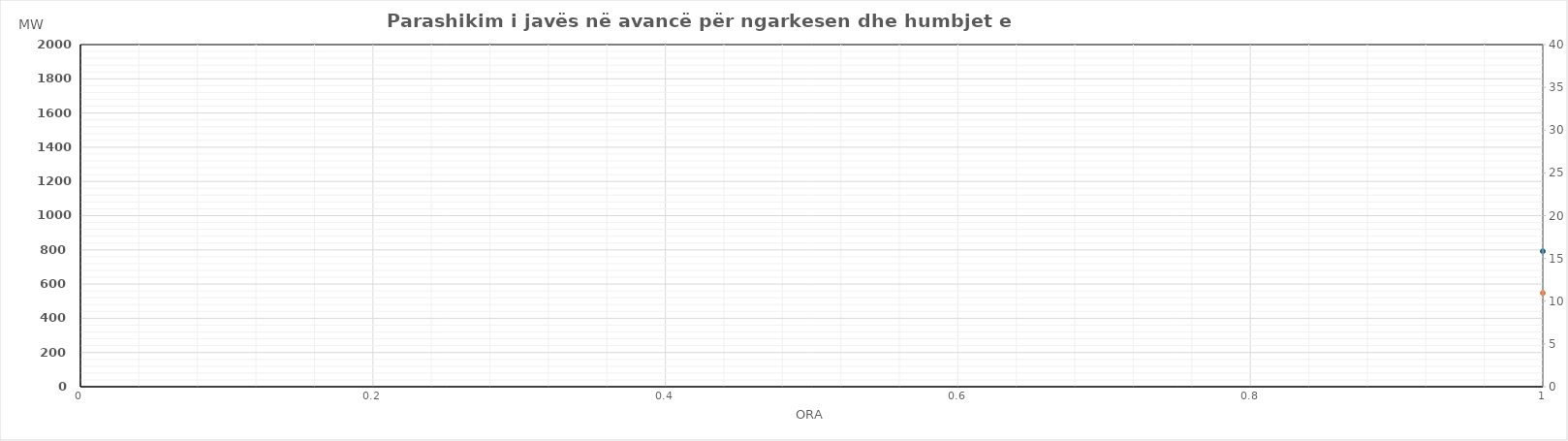
| Category | Ngarkesa (MWh) |
|---|---|
| 0 | 547.99 |
| 1 | 465.35 |
| 2 | 449.32 |
| 3 | 482.35 |
| 4 | 465.37 |
| 5 | 391.16 |
| 6 | 708.09 |
| 7 | 1006.77 |
| 8 | 1068.9 |
| 9 | 1073.78 |
| 10 | 909.21 |
| 11 | 874.1 |
| 12 | 878.71 |
| 13 | 888.64 |
| 14 | 985.88 |
| 15 | 1039.46 |
| 16 | 1316.26 |
| 17 | 1478.53 |
| 18 | 1578.52 |
| 19 | 1583.52 |
| 20 | 1483.57 |
| 21 | 1394.71 |
| 22 | 1262.21 |
| 23 | 970.1 |
| 24 | 609.93 |
| 25 | 528.91 |
| 26 | 512.51 |
| 27 | 532.22 |
| 28 | 512.11 |
| 29 | 471.34 |
| 30 | 729.36 |
| 31 | 948.77 |
| 32 | 1026.42 |
| 33 | 1041.46 |
| 34 | 995.05 |
| 35 | 1058.05 |
| 36 | 1059.02 |
| 37 | 1090.76 |
| 38 | 1146.44 |
| 39 | 1181.64 |
| 40 | 1506.62 |
| 41 | 1691.73 |
| 42 | 1699.69 |
| 43 | 1715.69 |
| 44 | 1629.98 |
| 45 | 1416.49 |
| 46 | 1244.57 |
| 47 | 965.11 |
| 48 | 619.12 |
| 49 | 492.72 |
| 50 | 456.62 |
| 51 | 469.83 |
| 52 | 438.32 |
| 53 | 402.64 |
| 54 | 745.98 |
| 55 | 1027.46 |
| 56 | 1098.88 |
| 57 | 982.79 |
| 58 | 873.78 |
| 59 | 806.67 |
| 60 | 797.14 |
| 61 | 809.42 |
| 62 | 793.65 |
| 63 | 860.51 |
| 64 | 1211.71 |
| 65 | 1403.7 |
| 66 | 1486.29 |
| 67 | 1481.78 |
| 68 | 1377.37 |
| 69 | 1149.57 |
| 70 | 962.28 |
| 71 | 708.98 |
| 72 | 563.51 |
| 73 | 430.7 |
| 74 | 428.98 |
| 75 | 424.98 |
| 76 | 421.98 |
| 77 | 469.18 |
| 78 | 646.99 |
| 79 | 898.28 |
| 80 | 933.16 |
| 81 | 973.03 |
| 82 | 921.5 |
| 83 | 700.75 |
| 84 | 683.66 |
| 85 | 679.65 |
| 86 | 677.43 |
| 87 | 681.47 |
| 88 | 1060.33 |
| 89 | 1318.33 |
| 90 | 1402.89 |
| 91 | 1393.4 |
| 92 | 1312.11 |
| 93 | 1183.23 |
| 94 | 936.82 |
| 95 | 667.52 |
| 96 | 560.51 |
| 97 | 522.01 |
| 98 | 480.32 |
| 99 | 472.32 |
| 100 | 471.32 |
| 101 | 516.15 |
| 102 | 639.59 |
| 103 | 776.49 |
| 104 | 704.87 |
| 105 | 755.79 |
| 106 | 702.96 |
| 107 | 661.27 |
| 108 | 674.75 |
| 109 | 772.26 |
| 110 | 775.55 |
| 111 | 809.19 |
| 112 | 1020.44 |
| 113 | 1199.22 |
| 114 | 1488.32 |
| 115 | 1462.68 |
| 116 | 1361.27 |
| 117 | 1259.68 |
| 118 | 833.57 |
| 119 | 707.96 |
| 120 | 546.41 |
| 121 | 483.16 |
| 122 | 442.6 |
| 123 | 480.85 |
| 124 | 494.4 |
| 125 | 511.44 |
| 126 | 620.47 |
| 127 | 743.07 |
| 128 | 800.29 |
| 129 | 789 |
| 130 | 567.52 |
| 131 | 559.1 |
| 132 | 550.93 |
| 133 | 548.05 |
| 134 | 722.63 |
| 135 | 772.91 |
| 136 | 816.84 |
| 137 | 962.8 |
| 138 | 1179.2 |
| 139 | 1194.2 |
| 140 | 1166.39 |
| 141 | 1060.22 |
| 142 | 801.62 |
| 143 | 646.42 |
| 144 | 560.54 |
| 145 | 497.95 |
| 146 | 437.81 |
| 147 | 455.48 |
| 148 | 419.56 |
| 149 | 501.11 |
| 150 | 602.02 |
| 151 | 673.8 |
| 152 | 726.7 |
| 153 | 554.44 |
| 154 | 540.36 |
| 155 | 458.68 |
| 156 | 450.46 |
| 157 | 614.32 |
| 158 | 599.98 |
| 159 | 615.72 |
| 160 | 646.94 |
| 161 | 795.43 |
| 162 | 1022.92 |
| 163 | 1056.69 |
| 164 | 902.12 |
| 165 | 784.7 |
| 166 | 637.29 |
| 167 | 715.38 |